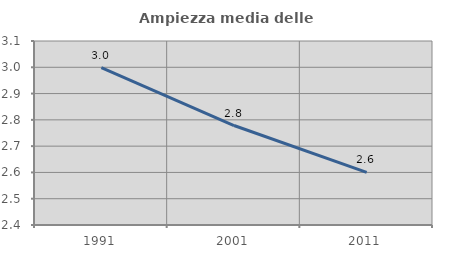
| Category | Ampiezza media delle famiglie |
|---|---|
| 1991.0 | 2.999 |
| 2001.0 | 2.778 |
| 2011.0 | 2.6 |